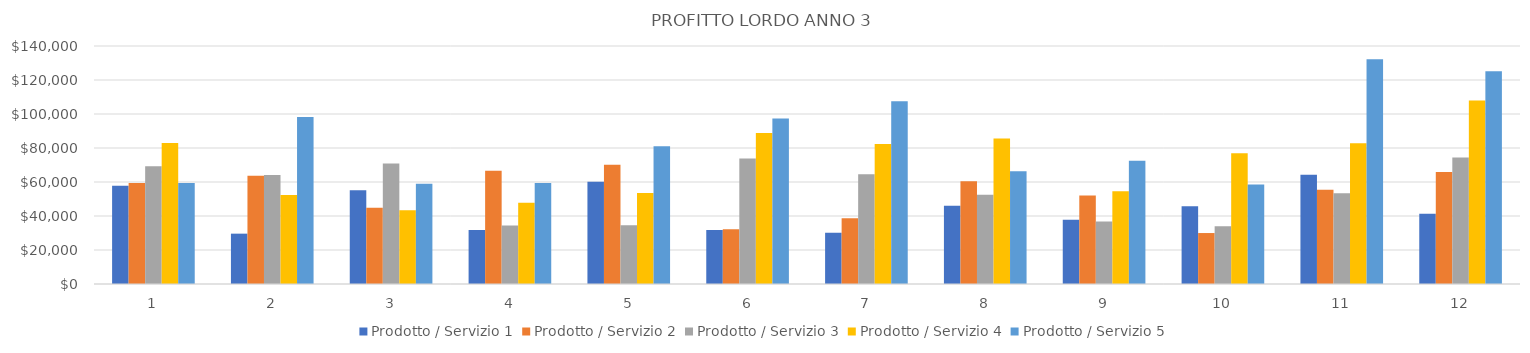
| Category | Prodotto / Servizio 1 | Prodotto / Servizio 2 | Prodotto / Servizio 3 | Prodotto / Servizio 4 | Prodotto / Servizio 5 |
|---|---|---|---|---|---|
| 0 | 57836.6 | 59440 | 69246 | 82984 | 59413.5 |
| 1 | 29614.1 | 63648 | 64143 | 52347.6 | 98185.5 |
| 2 | 55166.4 | 44895 | 70812 | 43367.7 | 58932.5 |
| 3 | 31708.8 | 66690.6 | 34479 | 47752.2 | 59427.5 |
| 4 | 60206.4 | 70077.2 | 34560 | 53457.6 | 81075 |
| 5 | 31779.6 | 32250.6 | 73809 | 88777.8 | 97290 |
| 6 | 30153.7 | 38663 | 64629 | 82350.9 | 107459.5 |
| 7 | 46071.9 | 60368.4 | 52452 | 85547.7 | 66308.5 |
| 8 | 37793.3 | 52053.6 | 36738 | 54600.9 | 72485.5 |
| 9 | 45727.2 | 29979.2 | 33957 | 76889.7 | 58522 |
| 10 | 64291.5 | 55457.4 | 53364 | 82752.7 | 132151.5 |
| 11 | 41314 | 65830.8 | 74340 | 108009.5 | 125209.5 |